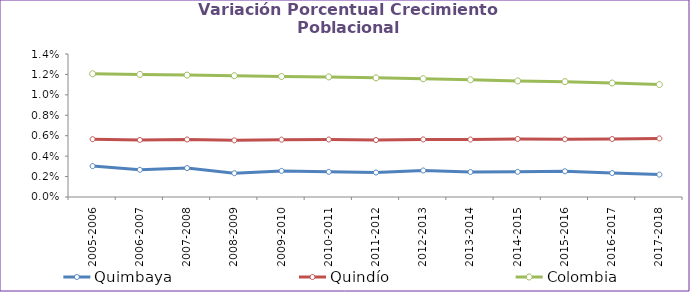
| Category | Quimbaya | Quindío | Colombia |
|---|---|---|---|
| 2005-2006 | 0.003 | 0.006 | 0.012 |
| 2006-2007 | 0.003 | 0.006 | 0.012 |
| 2007-2008 | 0.003 | 0.006 | 0.012 |
| 2008-2009 | 0.002 | 0.006 | 0.012 |
| 2009-2010 | 0.003 | 0.006 | 0.012 |
| 2010-2011 | 0.002 | 0.006 | 0.012 |
| 2011-2012 | 0.002 | 0.006 | 0.012 |
| 2012-2013 | 0.003 | 0.006 | 0.012 |
| 2013-2014 | 0.002 | 0.006 | 0.011 |
| 2014-2015 | 0.002 | 0.006 | 0.011 |
| 2015-2016 | 0.003 | 0.006 | 0.011 |
| 2016-2017 | 0.002 | 0.006 | 0.011 |
| 2017-2018 | 0.002 | 0.006 | 0.011 |